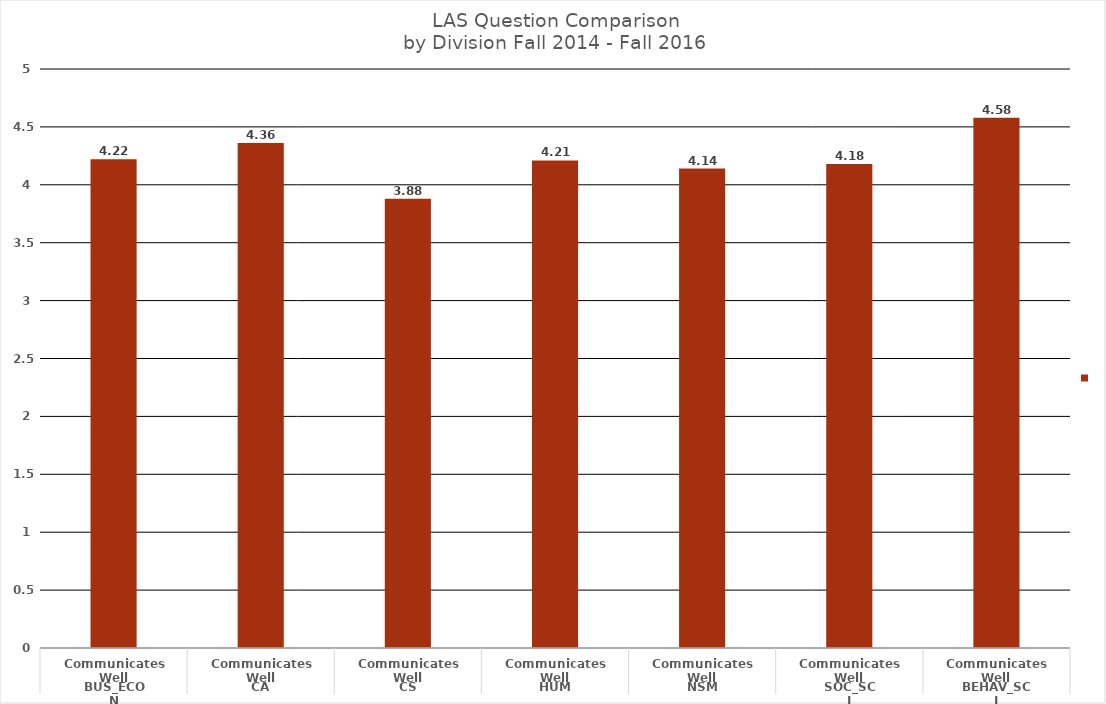
| Category | Fall 2016 |
|---|---|
| 0 | 4.22 |
| 1 | 4.36 |
| 2 | 3.88 |
| 3 | 4.21 |
| 4 | 4.14 |
| 5 | 4.18 |
| 6 | 4.58 |